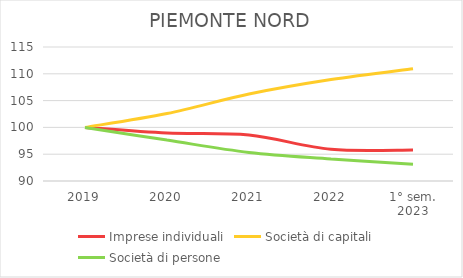
| Category | Imprese individuali | Società di capitali | Società di persone |
|---|---|---|---|
| 2019 | 100 | 100 | 100 |
| 2020 | 98.946 | 102.582 | 97.63 |
| 2021 | 98.57 | 106.222 | 95.337 |
| 2022 | 95.914 | 108.92 | 94.126 |
| 1° sem.
2023 | 95.799 | 110.956 | 93.122 |